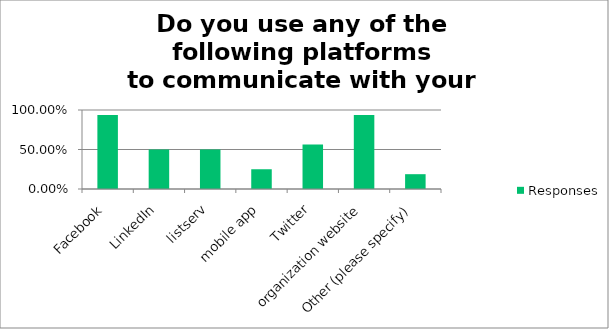
| Category | Responses |
|---|---|
| Facebook | 0.938 |
| LinkedIn | 0.5 |
| listserv | 0.5 |
| mobile app | 0.25 |
| Twitter | 0.562 |
| organization website | 0.938 |
| Other (please specify) | 0.188 |